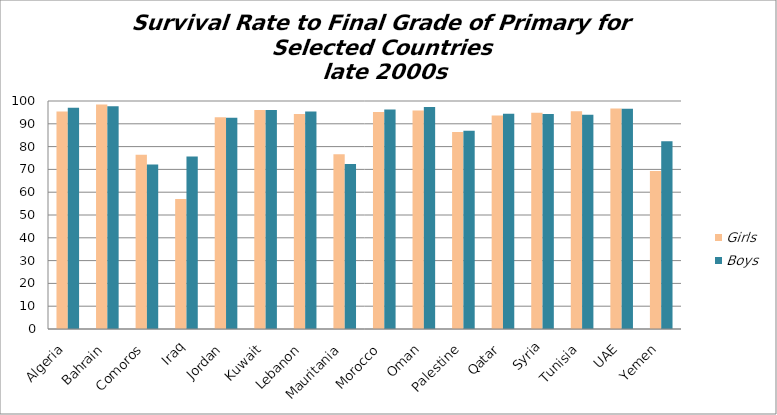
| Category | Girls | Boys |
|---|---|---|
| Algeria | 95.365 | 97.024 |
| Bahrain | 98.448 | 97.67 |
| Comoros | 76.406 | 72.17 |
| Iraq | 56.965 | 75.699 |
| Jordan | 92.833 | 92.632 |
| Kuwait | 96.021 | 96.047 |
| Lebanon | 94.346 | 95.446 |
| Mauritania | 76.655 | 72.391 |
| Morocco | 95.123 | 96.324 |
| Oman | 95.861 | 97.351 |
| Palestine | 86.368 | 86.976 |
| Qatar | 93.603 | 94.362 |
| Syria | 94.892 | 94.308 |
| Tunisia | 95.481 | 93.932 |
| UAE | 96.682 | 96.644 |
| Yemen | 69.287 | 82.396 |